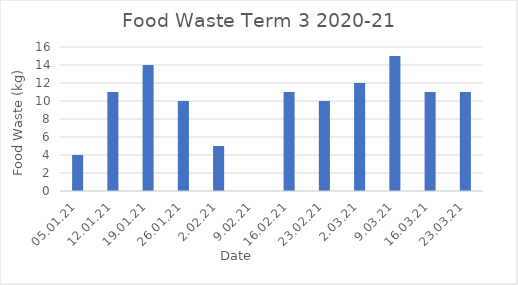
| Category | Series 0 |
|---|---|
| 05.01.21 | 4 |
| 12.01.21 | 11 |
| 19.01.21 | 14 |
| 26.01.21 | 10 |
| 2.02.21 | 5 |
| 9.02.21 | 0 |
| 16.02.21 | 11 |
| 23.02.21 | 10 |
| 2.03.21 | 12 |
| 9.03.21 | 15 |
| 16.03.21 | 11 |
| 23.03.21 | 11 |